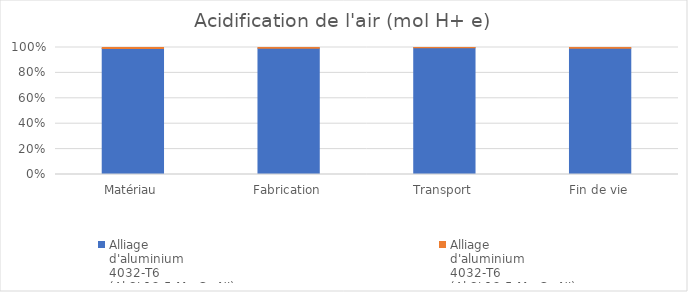
| Category | Alliage
d'aluminium
4032-T6
(Al Si 12,5 Mg Cu Ni)
Biellette initiale | Alliage
d'aluminium
4032-T6
(Al Si 12,5 Mg Cu Ni)
Biellette modifiée |
|---|---|---|
| Matériau | 1.2 | 0.009 |
| Fabrication | 0.036 | 0 |
| Transport | 0.021 | 0 |
| Fin de vie | 0.006 | 0 |